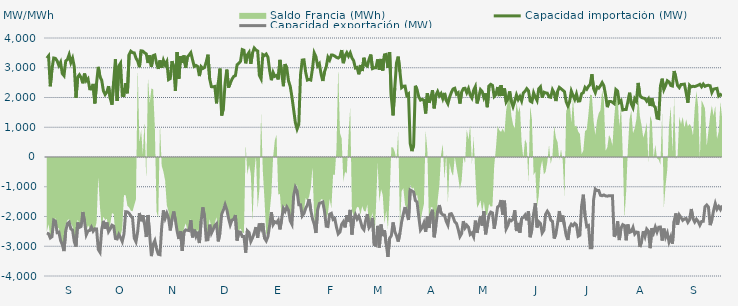
| Category | Capacidad importación (MW) | Capacidad exportación (MW) |
|---|---|---|
| 0 | 3322.042 | -2559.25 |
| 1900-01-01 | 3397.292 | -2579.208 |
| 1900-01-02 | 2377.292 | -2722 |
| 1900-01-03 | 2966.875 | -2678.583 |
| 1900-01-04 | 3327.583 | -2120.833 |
| 1900-01-05 | 3314.125 | -2154.167 |
| 1900-01-06 | 3229.625 | -2542.417 |
| 1900-01-07 | 3075.125 | -2524.125 |
| 1900-01-08 | 3186.833 | -2800.875 |
| 1900-01-09 | 2804.417 | -2944.208 |
| 1900-01-10 | 2733.75 | -3162.5 |
| 1900-01-11 | 3225.458 | -2491.042 |
| 1900-01-12 | 3275.667 | -2238.417 |
| 1900-01-13 | 3439.5 | -2190.417 |
| 1900-01-14 | 3175.292 | -2417.375 |
| 1900-01-15 | 3321.875 | -2458.417 |
| 1900-01-16 | 3034.917 | -2846.167 |
| 1900-01-17 | 1991.917 | -3010.667 |
| 1900-01-18 | 2685.833 | -2200.25 |
| 1900-01-19 | 2763.167 | -2365.208 |
| 1900-01-20 | 2664.875 | -2334.375 |
| 1900-01-21 | 2477.792 | -1849.417 |
| 1900-01-22 | 2804.25 | -2175.083 |
| 1900-01-23 | 2563.458 | -2614.833 |
| 1900-01-24 | 2629.917 | -2484.333 |
| 1900-01-25 | 2292 | -2469.792 |
| 1900-01-26 | 2284.542 | -2356.917 |
| 1900-01-27 | 2456.5 | -2494.792 |
| 1900-01-28 | 1801.792 | -2413.833 |
| 1900-01-29 | 2484.917 | -2419 |
| 1900-01-30 | 3029.417 | -3108.292 |
| 1900-01-31 | 2693.417 | -3201.125 |
| 1900-02-01 | 2579.5 | -2439 |
| 1900-02-02 | 2220.833 | -2146.167 |
| 1900-02-03 | 2100 | -2410.292 |
| 1900-02-04 | 2179.167 | -2202.083 |
| 1900-02-05 | 2381.25 | -2508.5 |
| 1900-02-06 | 1970.833 | -2414.375 |
| 1900-02-07 | 1758.333 | -2292.792 |
| 1900-02-08 | 2544 | -2324.083 |
| 1900-02-09 | 3285.125 | -2739.75 |
| 1900-02-10 | 1885.375 | -2754.917 |
| 1900-02-11 | 3057.958 | -2601 |
| 1900-02-12 | 3152.583 | -2708.375 |
| 1900-02-13 | 2068.833 | -2840.833 |
| 1900-02-14 | 2060.917 | -2586.417 |
| 1900-02-15 | 2484.25 | -1839.417 |
| 1900-02-16 | 2141.208 | -1845.833 |
| 1900-02-17 | 3445.375 | -1893.75 |
| 1900-02-18 | 3555.25 | -1979.583 |
| 1900-02-19 | 3506.875 | -2054.167 |
| 1900-02-20 | 3499.292 | -2730 |
| 1900-02-21 | 3321.917 | -2848.375 |
| 1900-02-22 | 3225.583 | -2505.583 |
| 1900-02-23 | 3019.583 | -1882.958 |
| 1900-02-24 | 3568.667 | -2157.833 |
| 1900-02-25 | 3559.375 | -1957.75 |
| 1900-02-26 | 3503.125 | -2252.375 |
| 1900-02-27 | 3464.458 | -2689.458 |
| 1900-02-28 | 3159.52 | -1949.52 |
| 1900-02-28 | 3414.875 | -2624.75 |
| 1900-03-01 | 3028.417 | -3331.875 |
| 1900-03-02 | 3406.833 | -2936.5 |
| 1900-03-03 | 3428.875 | -2811.25 |
| 1900-03-04 | 3154.208 | -3088.625 |
| 1900-03-05 | 2961.542 | -3268.083 |
| 1900-03-06 | 3246.75 | -3285.125 |
| 1900-03-07 | 2998.792 | -2359.333 |
| 1900-03-08 | 3250.625 | -1795.833 |
| 1900-03-09 | 3098.083 | -2058.458 |
| 1900-03-10 | 3208.458 | -1889.583 |
| 1900-03-11 | 2600.833 | -2050 |
| 1900-03-12 | 2636.458 | -2468.208 |
| 1900-03-13 | 3221.75 | -2100 |
| 1900-03-14 | 3030.917 | -1831.25 |
| 1900-03-15 | 2221.417 | -2127.083 |
| 1900-03-16 | 3529.833 | -2490.5 |
| 1900-03-17 | 2631.583 | -2756.25 |
| 1900-03-18 | 3389.417 | -2493.667 |
| 1900-03-19 | 3161.917 | -3158.375 |
| 1900-03-20 | 3412.417 | -2518.792 |
| 1900-03-21 | 3004.917 | -2450.333 |
| 1900-03-22 | 3360.75 | -2463.25 |
| 1900-03-23 | 3427.958 | -2474.292 |
| 1900-03-24 | 3506.917 | -2123.5 |
| 1900-03-25 | 3269.708 | -2701.708 |
| 1900-03-26 | 3043.333 | -2440.417 |
| 1900-03-27 | 3078.833 | -2660.667 |
| 1900-03-28 | 3042.542 | -2510.25 |
| 1900-03-29 | 2720.083 | -2892.208 |
| 1900-03-30 | 3035.792 | -2156.833 |
| 1900-03-31 | 2973.125 | -1691.667 |
| 1900-04-01 | 3008.708 | -2006.25 |
| 1900-04-02 | 3198.417 | -2788.271 |
| 1900-04-03 | 3439.5 | -2780.875 |
| 1900-04-04 | 2626.625 | -2273 |
| 1900-04-05 | 2364.583 | -2564.167 |
| 1900-04-06 | 2360.417 | -2440.708 |
| 1900-04-07 | 2372.917 | -2302.125 |
| 1900-04-08 | 1804.167 | -2241.25 |
| 1900-04-09 | 2476.875 | -2836.292 |
| 1900-04-10 | 2972.208 | -2552.292 |
| 1900-04-11 | 1394.917 | -1922 |
| 1900-04-12 | 1635.417 | -1780.667 |
| 1900-04-13 | 2487.208 | -1602.083 |
| 1900-04-14 | 2938.333 | -1770.833 |
| 1900-04-15 | 2333.708 | -2058.75 |
| 1900-04-16 | 2480.333 | -2280.5 |
| 1900-04-17 | 2612.458 | -2120.333 |
| 1900-04-18 | 2705.792 | -2095.25 |
| 1900-04-19 | 2735.375 | -1951.833 |
| 1900-04-20 | 3100.375 | -2807.583 |
| 1900-04-21 | 3154.125 | -2514.417 |
| 1900-04-22 | 3216.042 | -2530.208 |
| 1900-04-23 | 3609.167 | -2672.875 |
| 1900-04-24 | 3585.958 | -2674.5 |
| 1900-04-25 | 3148.417 | -3214.25 |
| 1900-04-26 | 3433.542 | -2480.667 |
| 1900-04-27 | 3518.5 | -2539.5 |
| 1900-04-28 | 3130.292 | -2838.583 |
| 1900-04-29 | 3499.167 | -2718.417 |
| 1900-04-30 | 3663.042 | -2554.083 |
| 1900-05-01 | 3596.708 | -2355.75 |
| 1900-05-02 | 3562.792 | -2716.417 |
| 1900-05-03 | 2738.75 | -2235.333 |
| 1900-05-04 | 2625.667 | -2410 |
| 1900-05-05 | 3444.083 | -2226.333 |
| 1900-05-06 | 3408.75 | -2728 |
| 1900-05-07 | 3460.583 | -2820.25 |
| 1900-05-08 | 3350.75 | -2676.083 |
| 1900-05-09 | 2899.917 | -2289.583 |
| 1900-05-10 | 2581.708 | -1858.083 |
| 1900-05-11 | 2842.042 | -2272.417 |
| 1900-05-12 | 2711.125 | -2177.417 |
| 1900-05-13 | 2740.458 | -2209.667 |
| 1900-05-14 | 2608.583 | -2127.083 |
| 1900-05-15 | 3264.042 | -2433.083 |
| 1900-05-16 | 2836.375 | -2085.417 |
| 1900-05-17 | 2379.792 | -1727.083 |
| 1900-05-18 | 3123.25 | -1827.083 |
| 1900-05-19 | 2982.792 | -1681.25 |
| 1900-05-20 | 2556.667 | -1789.667 |
| 1900-05-21 | 2375.667 | -2149.333 |
| 1900-05-22 | 2017.208 | -2261.458 |
| 1900-05-23 | 1585 | -1297.917 |
| 1900-05-24 | 1154.167 | -1022.917 |
| 1900-05-25 | 939.583 | -1143.75 |
| 1900-05-26 | 1093.75 | -1604.167 |
| 1900-05-27 | 2763.333 | -1604.167 |
| 1900-05-28 | 3256.375 | -1980.875 |
| 1900-05-29 | 3265.958 | -1897.917 |
| 1900-05-30 | 2849.625 | -1726.333 |
| 1900-05-31 | 2586.542 | -1614.583 |
| 1900-06-01 | 2607.375 | -1416.667 |
| 1900-06-02 | 2587.208 | -1789.583 |
| 1900-06-03 | 2978.5 | -2081.25 |
| 1900-06-04 | 3497.083 | -2256.292 |
| 1900-06-05 | 3370 | -2554.542 |
| 1900-06-06 | 3061.75 | -1771.917 |
| 1900-06-07 | 3134.875 | -1562.5 |
| 1900-06-08 | 2789.5 | -1537.5 |
| 1900-06-09 | 2555.75 | -1512.5 |
| 1900-06-10 | 2867.083 | -1825 |
| 1900-06-11 | 3026.833 | -2326.458 |
| 1900-06-12 | 3354.833 | -2337.292 |
| 1900-06-13 | 3258.292 | -1924.167 |
| 1900-06-14 | 3426.125 | -1893.75 |
| 1900-06-15 | 3424.167 | -2100 |
| 1900-06-16 | 3391.208 | -2070.833 |
| 1900-06-17 | 3348.208 | -2362.208 |
| 1900-06-18 | 3325.958 | -2584.917 |
| 1900-06-19 | 3372.292 | -2526.125 |
| 1900-06-20 | 3594.458 | -2261.833 |
| 1900-06-21 | 3154.208 | -2177.542 |
| 1900-06-22 | 3406.542 | -2366 |
| 1900-06-23 | 3506.792 | -1962 |
| 1900-06-24 | 3388.292 | -2170.833 |
| 1900-06-25 | 3502.625 | -1778.917 |
| 1900-06-26 | 3329.875 | -2606.583 |
| 1900-06-27 | 3238.958 | -2081.917 |
| 1900-06-28 | 2990.542 | -1937.25 |
| 1900-06-29 | 3009.542 | -2084.208 |
| 1900-06-30 | 2780.333 | -1987.25 |
| 1900-07-01 | 3090.792 | -2157.25 |
| 1900-07-02 | 2889.375 | -2369.167 |
| 1900-07-03 | 3335.375 | -2443.917 |
| 1900-07-04 | 3086.625 | -2135.417 |
| 1900-07-05 | 3054 | -1916.417 |
| 1900-07-06 | 3285.417 | -2373 |
| 1900-07-07 | 3443.292 | -2289.333 |
| 1900-07-08 | 2971.208 | -2047.917 |
| 1900-07-09 | 2996.292 | -2944.458 |
| 1900-07-10 | 3001.167 | -2971.542 |
| 1900-07-11 | 3281.375 | -2314.833 |
| 1900-07-12 | 2936.042 | -3043.167 |
| 1900-07-13 | 3294.792 | -2270.333 |
| 1900-07-14 | 2907.375 | -2657.667 |
| 1900-07-15 | 3433.583 | -2462.5 |
| 1900-07-16 | 3449.042 | -2914.583 |
| 1900-07-17 | 2992.458 | -3358.458 |
| 1900-07-18 | 3524.375 | -2728.208 |
| 1900-07-19 | 2000 | -2643.375 |
| 1900-07-20 | 1400 | -2200 |
| 1900-07-21 | 2323.375 | -2514.75 |
| 1900-07-22 | 3160.167 | -2645.333 |
| 1900-07-23 | 3372.083 | -2842.167 |
| 1900-07-24 | 2865.739 | -2564.565 |
| 1900-07-25 | 2332.667 | -2181.833 |
| 1900-07-26 | 2376.083 | -1906.25 |
| 1900-07-27 | 2381.25 | -1683.333 |
| 1900-07-28 | 2070.833 | -1891.667 |
| 1900-07-29 | 2120.083 | -2118.75 |
| 1900-07-30 | 449.25 | -1108.333 |
| 1900-07-31 | 200 | -1139.583 |
| 1900-08-01 | 395.833 | -1179.167 |
| 1900-08-02 | 2393.75 | -1462.5 |
| 1900-08-03 | 2262.25 | -1512.5 |
| 1900-08-04 | 2020.833 | -2007.167 |
| 1900-08-05 | 1912.5 | -2455.208 |
| 1900-08-06 | 1939.583 | -2371.125 |
| 1900-08-07 | 1908.333 | -2217.958 |
| 1900-08-08 | 1462.5 | -2517.542 |
| 1900-08-09 | 2145.208 | -2000.417 |
| 1900-08-10 | 1820.833 | -2386.167 |
| 1900-08-11 | 1983.333 | -1930.75 |
| 1900-08-12 | 2245.833 | -1772.917 |
| 1900-08-13 | 1635.417 | -2697.5 |
| 1900-08-14 | 2079.167 | -2299.625 |
| 1900-08-15 | 2200 | -1818.75 |
| 1900-08-16 | 2052.083 | -1616.667 |
| 1900-08-17 | 2133.333 | -1885.417 |
| 1900-08-18 | 1962.5 | -1940.792 |
| 1900-08-19 | 2154.167 | -1955.875 |
| 1900-08-20 | 1906.25 | -2160.458 |
| 1900-08-21 | 1791.667 | -2289.583 |
| 1900-08-22 | 2014.583 | -1920.333 |
| 1900-08-23 | 2166.667 | -1904.167 |
| 1900-08-24 | 2285.417 | -2016.25 |
| 1900-08-25 | 2310.417 | -2177.917 |
| 1900-08-26 | 2114.583 | -2230.875 |
| 1900-08-27 | 2160.417 | -2431.625 |
| 1900-08-28 | 1797.917 | -2674.417 |
| 1900-08-29 | 2180.625 | -2574 |
| 1900-08-30 | 2300 | -2155.333 |
| 1900-08-31 | 2310.417 | -2380.708 |
| 1900-09-01 | 2160.417 | -2290.5 |
| 1900-09-02 | 2295.833 | -2360.958 |
| 1900-09-03 | 2083.333 | -2603 |
| 1900-09-04 | 1983.333 | -2551.458 |
| 1900-09-05 | 2243.75 | -2680.375 |
| 1900-09-06 | 2364.583 | -2139.583 |
| 1900-09-07 | 1802.083 | -2551.375 |
| 1900-09-08 | 2012.5 | -2222.583 |
| 1900-09-09 | 2264.583 | -1983.333 |
| 1900-09-10 | 2200 | -2304.167 |
| 1900-09-11 | 1991.667 | -1823 |
| 1900-09-12 | 2139.583 | -2598.667 |
| 1900-09-13 | 1674.583 | -2262.5 |
| 1900-09-14 | 2391.667 | -1958.333 |
| 1900-09-15 | 2442.875 | -1852.083 |
| 1900-09-16 | 2406.25 | -1879.167 |
| 1900-09-17 | 2035.417 | -2408.5 |
| 1900-09-18 | 2093.75 | -2077.083 |
| 1900-09-19 | 2353.042 | -1679.167 |
| 1900-09-20 | 2047.917 | -1637.5 |
| 1900-09-21 | 2414.917 | -1445.833 |
| 1900-09-22 | 2054.167 | -1935.417 |
| 1900-09-23 | 2304.167 | -1468.75 |
| 1900-09-24 | 1852.083 | -2413.583 |
| 1900-09-25 | 1950 | -2298.583 |
| 1900-09-26 | 2204.167 | -2108.333 |
| 1900-09-27 | 1870.833 | -2142.875 |
| 1900-09-28 | 1693.75 | -2094.083 |
| 1900-09-29 | 1875 | -1793.75 |
| 1900-09-30 | 2087.5 | -2489.25 |
| 1900-10-01 | 1929.167 | -2216.167 |
| 1900-10-02 | 2031.25 | -2542 |
| 1900-10-03 | 1885.417 | -2072.833 |
| 1900-10-04 | 2156.25 | -2029.167 |
| 1900-10-05 | 2208.333 | -1953 |
| 1900-10-06 | 2297.917 | -2127.083 |
| 1900-10-07 | 2229.167 | -1822.917 |
| 1900-10-08 | 1879.167 | -2695.583 |
| 1900-10-09 | 1845.833 | -2427.667 |
| 1900-10-10 | 2156.25 | -1908.417 |
| 1900-10-11 | 2010.417 | -1551.375 |
| 1900-10-12 | 1897.625 | -2367.333 |
| 1900-10-13 | 2291.667 | -2179.167 |
| 1900-10-14 | 2358.333 | -2236.833 |
| 1900-10-15 | 1997.917 | -2551.708 |
| 1900-10-16 | 2179.167 | -2457.875 |
| 1900-10-17 | 2156.25 | -1922.667 |
| 1900-10-18 | 2145.833 | -1823.917 |
| 1900-10-19 | 2022.917 | -1916.417 |
| 1900-10-20 | 2008.333 | -2121.167 |
| 1900-10-21 | 2260.417 | -2164.667 |
| 1900-10-22 | 2152.083 | -2739.958 |
| 1900-10-23 | 1881 | -2582.833 |
| 1900-10-24 | 2206.25 | -2222.083 |
| 1900-10-25 | 2339.583 | -1816.667 |
| 1900-10-26 | 2293.75 | -2177.833 |
| 1900-10-27 | 2245.833 | -1968.75 |
| 1900-10-28 | 2195.833 | -2304.458 |
| 1900-10-29 | 1858.208 | -2638.917 |
| 1900-10-30 | 1718.75 | -2788.083 |
| 1900-10-31 | 1858.333 | -2369.542 |
| 1900-11-01 | 2216.667 | -2260.583 |
| 1900-11-02 | 2066.667 | -2309.375 |
| 1900-11-03 | 1935.417 | -2231 |
| 1900-11-04 | 2118.292 | -2285.25 |
| 1900-11-05 | 1879.583 | -2663 |
| 1900-11-06 | 1887.5 | -2627.5 |
| 1900-11-07 | 2127.083 | -1647.917 |
| 1900-11-08 | 2162.5 | -1266.667 |
| 1900-11-09 | 2338.667 | -1964.583 |
| 1900-11-10 | 2277.083 | -2337.25 |
| 1900-11-11 | 2373.75 | -2304.167 |
| 1900-11-12 | 2435.083 | -3048.333 |
| 1900-11-13 | 2780.708 | -3048.208 |
| 1900-11-14 | 2300 | -1435 |
| 1900-11-15 | 2164.583 | -1077.083 |
| 1900-11-16 | 2350 | -1125 |
| 1900-11-17 | 2314.583 | -1125 |
| 1900-11-18 | 2395.625 | -1287.5 |
| 1900-11-19 | 2501.583 | -1302.083 |
| 1900-11-20 | 2389.417 | -1275 |
| 1900-11-21 | 2080.375 | -1308.333 |
| 1900-11-22 | 1675 | -1316.667 |
| 1900-11-23 | 1862.5 | -1300 |
| 1900-11-24 | 1866.708 | -1300 |
| 1900-11-25 | 1837.292 | -1300 |
| 1900-11-26 | 1793.75 | -2680.333 |
| 1900-11-27 | 2268.333 | -2563.75 |
| 1900-11-28 | 2217.333 | -2160.333 |
| 1900-11-29 | 1831.25 | -2791.75 |
| 1900-11-30 | 1890.083 | -2386.583 |
| 1900-12-01 | 1581.667 | -2273.25 |
| 1900-12-02 | 1595.833 | -2304.167 |
| 1900-12-03 | 1593.75 | -2799.042 |
| 1900-12-04 | 1860.75 | -2268.667 |
| 1900-12-05 | 2160.5 | -2533.875 |
| 1900-12-06 | 1785.417 | -2508.667 |
| 1900-12-07 | 1658.333 | -2368.167 |
| 1900-12-08 | 1958.333 | -2590.5 |
| 1900-12-09 | 1875.083 | -2522 |
| 1900-12-10 | 2489.792 | -2532.75 |
| 1900-12-11 | 2064.583 | -3024.833 |
| 1900-12-12 | 2001.333 | -2838.125 |
| 1900-12-13 | 1979.167 | -2490.417 |
| 1900-12-14 | 1966.667 | -2671.375 |
| 1900-12-15 | 1877.792 | -2424.333 |
| 1900-12-16 | 1957.75 | -2493.167 |
| 1900-12-17 | 1716.667 | -3063.708 |
| 1900-12-18 | 1978.5 | -2394.708 |
| 1900-12-19 | 1729.167 | -2549 |
| 1900-12-20 | 1666.667 | -2355.5 |
| 1900-12-21 | 1308.333 | -2520.458 |
| 1900-12-22 | 1293.75 | -2359.417 |
| 1900-12-23 | 2383.833 | -2353.167 |
| 1900-12-24 | 2632.25 | -2807.083 |
| 1900-12-25 | 2269.167 | -2407.042 |
| 1900-12-26 | 2400.75 | -2695.042 |
| 1900-12-27 | 2564.417 | -2553.583 |
| 1900-12-28 | 2525.583 | -2853.583 |
| 1900-12-29 | 2404.5 | -2690.292 |
| 1900-12-30 | 2386.042 | -2912.083 |
| 1900-12-31 | 2890.042 | -2155.708 |
| 1901-01-01 | 2668.625 | -1896.5 |
| 1901-01-02 | 2403.083 | -2272.75 |
| 1901-01-03 | 2332.833 | -1950 |
| 1901-01-04 | 2437.5 | -2037.5 |
| 1901-01-05 | 2441.667 | -2129 |
| 1901-01-06 | 2450 | -2079.167 |
| 1901-01-07 | 2159.292 | -2066.667 |
| 1901-01-08 | 1825 | -2195.667 |
| 1901-01-09 | 2412.5 | -2108.333 |
| 1901-01-10 | 2355.5 | -1747.917 |
| 1901-01-11 | 2377.083 | -2070.833 |
| 1901-01-12 | 2366.667 | -2185.333 |
| 1901-01-13 | 2387.5 | -2091.667 |
| 1901-01-14 | 2412.5 | -2164.583 |
| 1901-01-15 | 2443 | -2291.292 |
| 1901-01-16 | 2360.417 | -2168.75 |
| 1901-01-17 | 2450 | -2160.417 |
| 1901-01-18 | 2375 | -1668.75 |
| 1901-01-19 | 2402.083 | -1612.5 |
| 1901-01-20 | 2412 | -1683.333 |
| 1901-01-21 | 2393.75 | -2289.583 |
| 1901-01-22 | 2168.625 | -2114.083 |
| 1901-01-23 | 2281.25 | -1800 |
| 1901-01-24 | 2295.833 | -1566.667 |
| 1901-01-25 | 2306.25 | -1754.167 |
| 1901-01-26 | 2050 | -1662.5 |
| 1901-01-27 | 2100 | -1762.5 |
| 1901-01-28 | 2052.083 | -1629.167 |